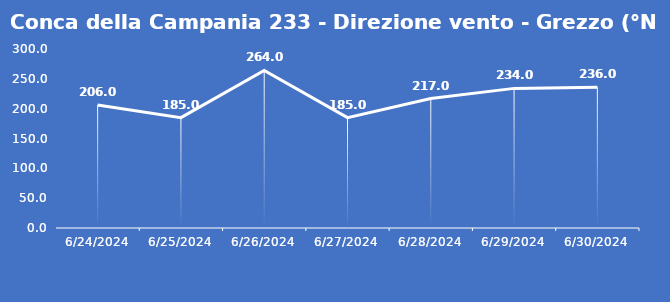
| Category | Conca della Campania 233 - Direzione vento - Grezzo (°N) |
|---|---|
| 6/24/24 | 206 |
| 6/25/24 | 185 |
| 6/26/24 | 264 |
| 6/27/24 | 185 |
| 6/28/24 | 217 |
| 6/29/24 | 234 |
| 6/30/24 | 236 |